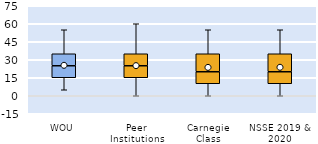
| Category | 25th | 50th | 75th |
|---|---|---|---|
| WOU | 15 | 10 | 10 |
| Peer Institutions | 15 | 10 | 10 |
| Carnegie Class | 10 | 10 | 15 |
| NSSE 2019 & 2020 | 10 | 10 | 15 |